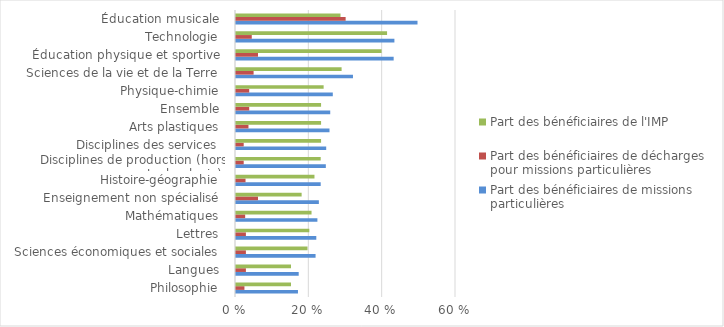
| Category | Part des bénéficiaires de missions particulières | Part des bénéficiaires de décharges pour missions particulières | Part des bénéficiaires de l'IMP |
|---|---|---|---|
| Philosophie | 0.169 | 0.023 | 0.15 |
| Langues | 0.171 | 0.027 | 0.15 |
| Sciences économiques et sociales | 0.217 | 0.027 | 0.195 |
| Lettres | 0.219 | 0.027 | 0.2 |
| Mathématiques | 0.222 | 0.025 | 0.206 |
| Enseignement non spécialisé | 0.226 | 0.06 | 0.179 |
| Histoire-géographie | 0.231 | 0.026 | 0.214 |
| Disciplines de production (hors technologie) | 0.245 | 0.021 | 0.231 |
| Disciplines des services | 0.246 | 0.021 | 0.232 |
| Arts plastiques | 0.255 | 0.034 | 0.232 |
| Ensemble | 0.257 | 0.036 | 0.232 |
| Physique-chimie | 0.264 | 0.036 | 0.239 |
| Sciences de la vie et de la Terre | 0.319 | 0.048 | 0.288 |
| Éducation physique et sportive | 0.43 | 0.06 | 0.397 |
| Technologie | 0.432 | 0.043 | 0.412 |
| Éducation musicale | 0.495 | 0.299 | 0.285 |